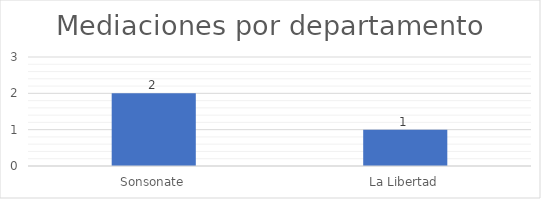
| Category | Socializaciones |
|---|---|
| Sonsonate | 2 |
| La Libertad | 1 |